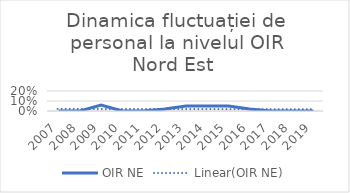
| Category | OIR NE |
|---|---|
| 2007.0 | 0 |
| 2008.0 | 0 |
| 2009.0 | 0.06 |
| 2010.0 | 0 |
| 2011.0 | 0 |
| 2012.0 | 0.02 |
| 2013.0 | 0.05 |
| 2014.0 | 0.05 |
| 2015.0 | 0.05 |
| 2016.0 | 0.02 |
| 2017.0 | 0 |
| 2018.0 | 0 |
| 2019.0 | 0 |